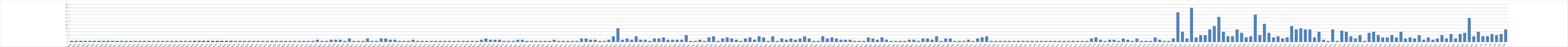
| Category | Series 0 |
|---|---|
| AW01 | 1 |
| AW02 | 1 |
| AW03 | 1 |
| AW04 | 1 |
| AW05 | 1 |
| AW06 | 1 |
| AW07 | 1 |
| AW08 | 1 |
| AW09 | 1 |
| AW10 | 1 |
| AW11 | 1 |
| AW12 | 1 |
| AW13 | 1 |
| AW14 | 1 |
| AW15 | 1 |
| AW16 | 1 |
| AW17 | 1 |
| AW18 | 1 |
| AW19 | 1 |
| AW20 | 1 |
| AW21 | 1 |
| AW22 | 1 |
| AW23 | 1 |
| AW24 | 1 |
| AW25 | 1 |
| AW26 | 1 |
| AW27 | 1 |
| AW28 | 1 |
| AW29 | 1 |
| AW30 | 1 |
| AW31 | 1 |
| AW32 | 1 |
| AW33 | 1 |
| AW34 | 1 |
| AW35 | 1 |
| AW36 | 1 |
| AW37 | 1 |
| AW38 | 1 |
| AW39 | 1 |
| AW40 | 1 |
| AW41 | 1 |
| AW42 | 1 |
| AW43 | 1 |
| AW44 | 1 |
| AW45 | 1 |
| AW46 | 1 |
| AW47 | 1 |
| AW48 | 1 |
| AW49 | 1 |
| AW50 | 1 |
| AW51 | 1 |
| AW52 | 1 |
| AW53 | 1 |
| BW01 | 1 |
| BW02 | 2 |
| BW03 | 1 |
| BW04 | 1 |
| BW05 | 2 |
| BW06 | 2 |
| BW07 | 2 |
| BW08 | 1 |
| BW09 | 3 |
| BW10 | 1 |
| BW11 | 1 |
| BW12 | 1 |
| BW13 | 3 |
| BW14 | 1 |
| BW15 | 1 |
| BW16 | 3 |
| BW17 | 3 |
| BW18 | 2 |
| BW19 | 2 |
| BW20 | 1 |
| BW21 | 1 |
| BW22 | 1 |
| BW23 | 2 |
| BW24 | 1 |
| BW25 | 1 |
| BW26 | 1 |
| BW27 | 1 |
| BW28 | 1 |
| BW29 | 1 |
| BW30 | 1 |
| BW31 | 1 |
| BW32 | 1 |
| BW33 | 1 |
| BW34 | 1 |
| BW35 | 1 |
| BW36 | 1 |
| BW37 | 1 |
| BW38 | 2 |
| BW39 | 3 |
| BW40 | 2 |
| BW41 | 2 |
| BW42 | 2 |
| BW43 | 1 |
| CW01 | 1 |
| CW02 | 1 |
| CW03 | 2 |
| CW04 | 2 |
| CW05 | 1 |
| CW06 | 1 |
| CW07 | 1 |
| CW08 | 1 |
| CW09 | 1 |
| CW10 | 1 |
| CW11 | 2 |
| CW12 | 1 |
| CW13 | 1 |
| CW14 | 1 |
| CW15 | 1 |
| CW16 | 1 |
| CW17 | 3 |
| CW18 | 3 |
| CW19 | 2 |
| CW20 | 2 |
| CW21 | 1 |
| CW22 | 1 |
| CW23 | 2 |
| CW24 | 5 |
| CW25 | 12 |
| CW26 | 2 |
| CW27 | 3 |
| CW28 | 2 |
| CW29 | 5 |
| CW30 | 2 |
| CW31 | 2 |
| CW32 | 1 |
| CW33 | 3 |
| CW34 | 3 |
| CW35 | 4 |
| CW36 | 2 |
| CW37 | 2 |
| CW38 | 2 |
| CW39 | 2 |
| CW40 | 6 |
| CW41 | 1 |
| CW42 | 1 |
| CW43 | 2 |
| CW44 | 1 |
| CW45 | 4 |
| CW46 | 5 |
| CW47 | 1 |
| CW48 | 3 |
| CW49 | 4 |
| CW50 | 3 |
| CW51 | 2 |
| CW52 | 1 |
| CW53 | 3 |
| CW54 | 4 |
| CW55 | 2 |
| CW56 | 5 |
| CW57 | 4 |
| CW58 | 1 |
| CW59 | 5 |
| CW60 | 1 |
| CW61 | 3 |
| CW62 | 2 |
| CW63 | 3 |
| CW64 | 2 |
| CW65 | 3 |
| CW66 | 5 |
| CW67 | 3 |
| CW68 | 1 |
| CW69 | 1 |
| CW70 | 5 |
| CW71 | 3 |
| CW72 | 4 |
| CW73 | 3 |
| CW74 | 2 |
| CW75 | 2 |
| CW76 | 2 |
| CW77 | 1 |
| CW78 | 1 |
| CW79 | 1 |
| CW80 | 4 |
| CW81 | 3 |
| CW82 | 2 |
| CW83 | 4 |
| CW84 | 2 |
| CW85 | 1 |
| CW86 | 1 |
| CW87 | 1 |
| CW88 | 1 |
| CW89 | 2 |
| CW90 | 2 |
| CW91 | 1 |
| CW92 | 3 |
| CW93 | 3 |
| CW94 | 2 |
| CW95 | 5 |
| CW96 | 1 |
| CW97 | 3 |
| CW98 | 3 |
| CW99 | 1 |
| CW100 | 1 |
| CW101 | 1 |
| CW102 | 2 |
| CW103 | 1 |
| CW104 | 3 |
| CW105 | 4 |
| CW106 | 5 |
| CW107 | 1 |
| CW108 | 1 |
| A.U01 | 1 |
| A.U02 | 1 |
| A.U03 | 1 |
| A.U04 | 1 |
| A.U05 | 1 |
| A.U06 | 1 |
| A.U07 | 1 |
| A.U08 | 1 |
| A.U09 | 1 |
| A.U10 | 1 |
| A.U11 | 1 |
| A.U12 | 1 |
| A.U13 | 1 |
| A.U14 | 1 |
| A.U15 | 1 |
| A.U16 | 1 |
| A.U17 | 1 |
| A.U18 | 1 |
| A.U19 | 1 |
| B.U01 | 1 |
| B.U02 | 3 |
| B.U03 | 4 |
| B.U04 | 2 |
| B.U05 | 1 |
| B.U06 | 2 |
| B.U07 | 2 |
| B.U08 | 1 |
| B.U09 | 3 |
| B.U10 | 2 |
| B.U11 | 1 |
| B.U12 | 3 |
| B.U13 | 1 |
| B.U14 | 1 |
| B.U15 | 1 |
| B.U16 | 4 |
| B.U17 | 2 |
| B.U18 | 1 |
| B.U19 | 1 |
| B.U20 | 3 |
| C.U01 | 26 |
| C.U02 | 9 |
| C.U03 | 3 |
| C.U04 | 30 |
| C.U05 | 4 |
| C.U06 | 6 |
| C.U07 | 6 |
| C.U08 | 11 |
| C.U09 | 14 |
| C.U10 | 22 |
| C.U11 | 9 |
| C.U12 | 5 |
| C.U13 | 5 |
| C.U14 | 11 |
| C.U15 | 8 |
| C.U16 | 4 |
| C.U17 | 5 |
| C.U18 | 24 |
| C.U19 | 6 |
| C.U20 | 16 |
| C.U21 | 8 |
| C.U22 | 4 |
| C.U23 | 5 |
| C.U24 | 3 |
| C.U25 | 4 |
| C.U26 | 14 |
| C.U27 | 11 |
| C.U28 | 12 |
| C.U29 | 11 |
| C.U30 | 11 |
| C.U31 | 4 |
| C.U32 | 9 |
| C.U33 | 2 |
| C.U34 | 1 |
| C.U35 | 11 |
| C.U36 | 1 |
| C.U37 | 10 |
| C.U38 | 9 |
| C.U39 | 5 |
| C.U40 | 3 |
| C.U41 | 6 |
| C.U42 | 1 |
| C.U43 | 8 |
| C.U44 | 9 |
| C.U45 | 6 |
| C.U46 | 4 |
| C.U47 | 4 |
| C.U48 | 6 |
| C.U49 | 4 |
| C.U50 | 9 |
| C.U51 | 3 |
| C.U52 | 4 |
| C.U53 | 3 |
| C.U54 | 6 |
| C.U55 | 2 |
| C.U56 | 4 |
| C.U57 | 2 |
| C.U58 | 3 |
| C.U59 | 6 |
| C.U60 | 3 |
| C.U61 | 7 |
| C.U62 | 3 |
| C.U63 | 7 |
| C.U64 | 8 |
| C.U65 | 21 |
| C.U66 | 5 |
| C.U67 | 9 |
| K01 | 5 |
| K02 | 5 |
| K03 | 7 |
| K04 | 6 |
| K05 | 7 |
| K06 | 11 |